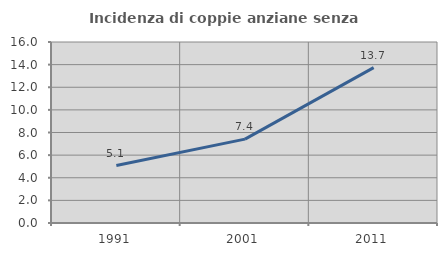
| Category | Incidenza di coppie anziane senza figli  |
|---|---|
| 1991.0 | 5.075 |
| 2001.0 | 7.412 |
| 2011.0 | 13.737 |